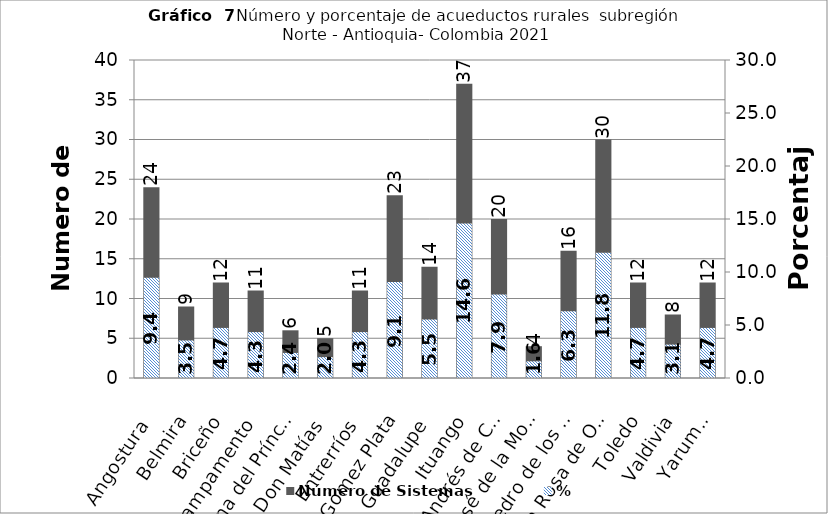
| Category | Número de Sistemas |
|---|---|
| Angostura | 24 |
| Belmira | 9 |
| Briceño | 12 |
| Campamento | 11 |
| Carolina del Príncipe | 6 |
| Don Matías | 5 |
| Entrerríos | 11 |
| Gómez Plata | 23 |
| Guadalupe | 14 |
| Ituango | 37 |
| San Andrés de Cuerquia | 20 |
| San José de la Montaña | 4 |
| San Pedro de los Milagros | 16 |
| Santa Rosa de Osos | 30 |
| Toledo | 12 |
| Valdivia | 8 |
| Yarumal | 12 |